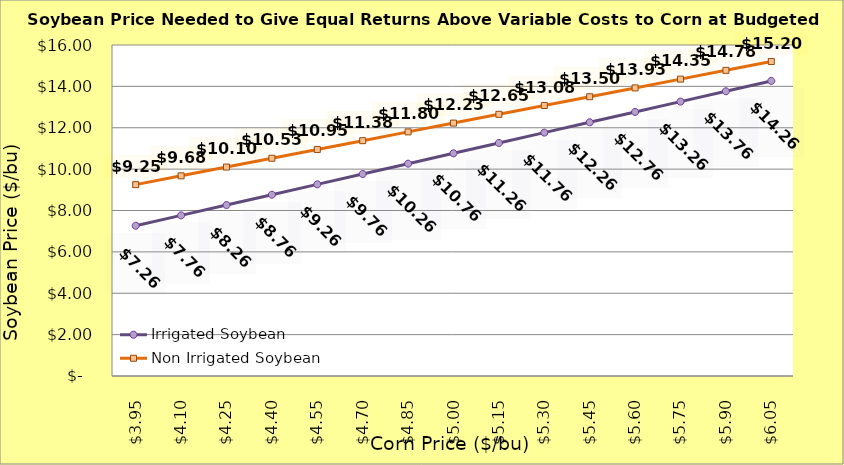
| Category | Irrigated Soybean | Non Irrigated Soybean |
|---|---|---|
| 3.949999999999998 | 7.264 | 9.25 |
| 4.099999999999998 | 7.764 | 9.675 |
| 4.249999999999998 | 8.264 | 10.1 |
| 4.399999999999999 | 8.764 | 10.525 |
| 4.549999999999999 | 9.264 | 10.95 |
| 4.699999999999999 | 9.764 | 11.375 |
| 4.85 | 10.264 | 11.8 |
| 5.0 | 10.764 | 12.225 |
| 5.15 | 11.264 | 12.65 |
| 5.300000000000001 | 11.764 | 13.075 |
| 5.450000000000001 | 12.264 | 13.5 |
| 5.600000000000001 | 12.764 | 13.925 |
| 5.750000000000002 | 13.264 | 14.35 |
| 5.900000000000002 | 13.764 | 14.775 |
| 6.0500000000000025 | 14.264 | 15.2 |